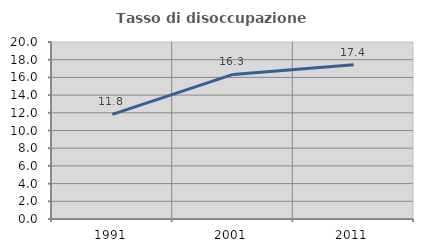
| Category | Tasso di disoccupazione giovanile  |
|---|---|
| 1991.0 | 11.814 |
| 2001.0 | 16.34 |
| 2011.0 | 17.431 |